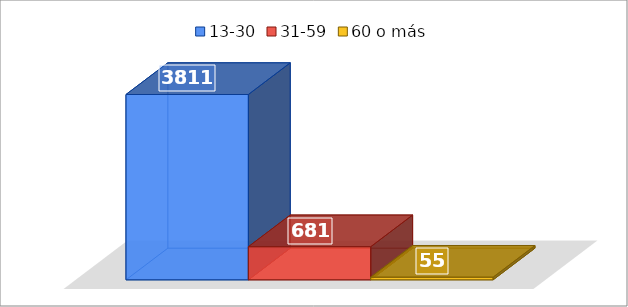
| Category | 13-30 | 31-59 | 60 o más |
|---|---|---|---|
| 0 | 3811 | 681 | 55 |